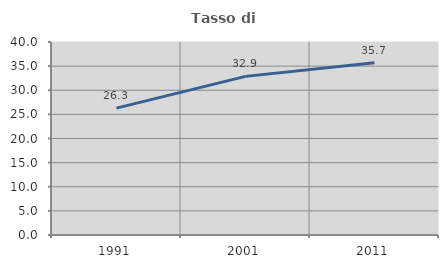
| Category | Tasso di occupazione   |
|---|---|
| 1991.0 | 26.296 |
| 2001.0 | 32.877 |
| 2011.0 | 35.689 |